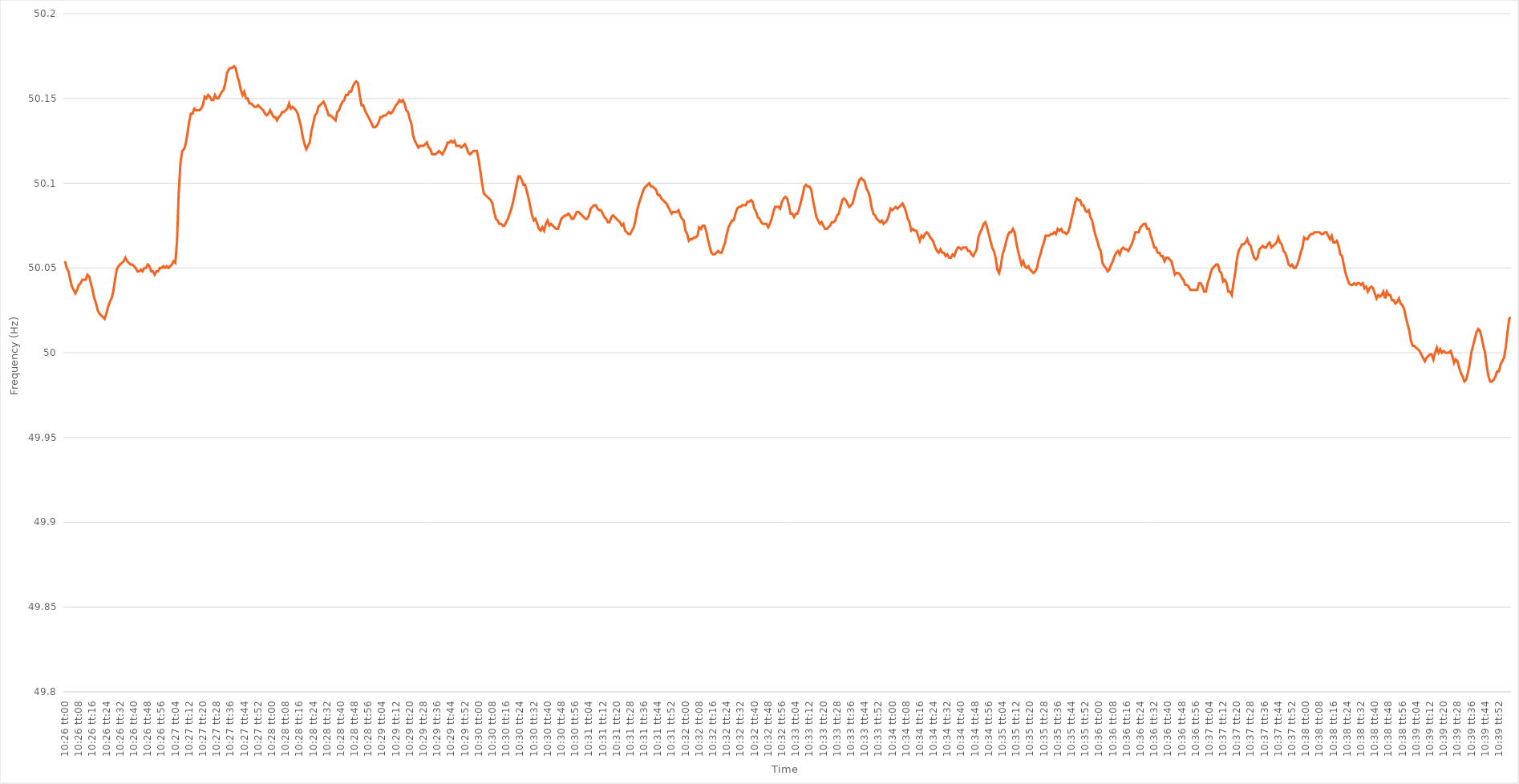
| Category | Series 0 |
|---|---|
| 0.43472222222222223 | 50.054 |
| 0.43473379629629627 | 50.05 |
| 0.43474537037037037 | 50.048 |
| 0.4347569444444444 | 50.043 |
| 0.43476851851851855 | 50.039 |
| 0.4347800925925926 | 50.037 |
| 0.4347916666666667 | 50.035 |
| 0.4348032407407407 | 50.037 |
| 0.4348148148148148 | 50.04 |
| 0.43482638888888886 | 50.041 |
| 0.434837962962963 | 50.043 |
| 0.43484953703703705 | 50.043 |
| 0.43486111111111114 | 50.043 |
| 0.4348726851851852 | 50.046 |
| 0.4348842592592593 | 50.045 |
| 0.4348958333333333 | 50.041 |
| 0.43490740740740735 | 50.037 |
| 0.4349189814814815 | 50.032 |
| 0.43493055555555554 | 50.029 |
| 0.43494212962962964 | 50.025 |
| 0.4349537037037037 | 50.023 |
| 0.43496527777777777 | 50.022 |
| 0.4349768518518518 | 50.021 |
| 0.43498842592592596 | 50.02 |
| 0.435 | 50.023 |
| 0.4350115740740741 | 50.027 |
| 0.43502314814814813 | 50.03 |
| 0.4350347222222222 | 50.032 |
| 0.43504629629629626 | 50.036 |
| 0.4350578703703704 | 50.043 |
| 0.43506944444444445 | 50.049 |
| 0.43508101851851855 | 50.051 |
| 0.4350925925925926 | 50.052 |
| 0.4351041666666667 | 50.053 |
| 0.4351157407407407 | 50.054 |
| 0.43512731481481487 | 50.056 |
| 0.4351388888888889 | 50.054 |
| 0.43515046296296295 | 50.053 |
| 0.43516203703703704 | 50.052 |
| 0.4351736111111111 | 50.052 |
| 0.4351851851851852 | 50.051 |
| 0.4351967592592592 | 50.05 |
| 0.43520833333333336 | 50.048 |
| 0.4352199074074074 | 50.048 |
| 0.4352314814814815 | 50.049 |
| 0.43524305555555554 | 50.048 |
| 0.43525462962962963 | 50.05 |
| 0.43526620370370367 | 50.05 |
| 0.4352777777777778 | 50.052 |
| 0.43528935185185186 | 50.051 |
| 0.43530092592592595 | 50.048 |
| 0.4353125 | 50.048 |
| 0.4353240740740741 | 50.046 |
| 0.4353356481481481 | 50.048 |
| 0.4353472222222223 | 50.048 |
| 0.4353587962962963 | 50.05 |
| 0.43537037037037035 | 50.05 |
| 0.43538194444444445 | 50.051 |
| 0.4353935185185185 | 50.05 |
| 0.4354050925925926 | 50.051 |
| 0.4354166666666666 | 50.05 |
| 0.43542824074074077 | 50.051 |
| 0.4354398148148148 | 50.052 |
| 0.4354513888888889 | 50.054 |
| 0.43546296296296294 | 50.053 |
| 0.43547453703703703 | 50.066 |
| 0.4354861111111111 | 50.095 |
| 0.4354976851851852 | 50.112 |
| 0.43550925925925926 | 50.119 |
| 0.43552083333333336 | 50.12 |
| 0.4355324074074074 | 50.123 |
| 0.4355439814814815 | 50.129 |
| 0.43555555555555553 | 50.136 |
| 0.4355671296296297 | 50.141 |
| 0.4355787037037037 | 50.141 |
| 0.4355902777777778 | 50.144 |
| 0.43560185185185185 | 50.143 |
| 0.43561342592592595 | 50.143 |
| 0.435625 | 50.143 |
| 0.435636574074074 | 50.144 |
| 0.4356481481481482 | 50.146 |
| 0.4356597222222222 | 50.151 |
| 0.4356712962962963 | 50.15 |
| 0.43568287037037035 | 50.152 |
| 0.43569444444444444 | 50.151 |
| 0.4357060185185185 | 50.149 |
| 0.43571759259259263 | 50.149 |
| 0.43572916666666667 | 50.152 |
| 0.43574074074074076 | 50.15 |
| 0.4357523148148148 | 50.15 |
| 0.4357638888888889 | 50.152 |
| 0.43577546296296293 | 50.154 |
| 0.4357870370370371 | 50.155 |
| 0.4357986111111111 | 50.159 |
| 0.4358101851851852 | 50.165 |
| 0.43582175925925926 | 50.167 |
| 0.43583333333333335 | 50.168 |
| 0.4358449074074074 | 50.168 |
| 0.43585648148148143 | 50.169 |
| 0.4358680555555556 | 50.168 |
| 0.4358796296296296 | 50.163 |
| 0.4358912037037037 | 50.16 |
| 0.43590277777777775 | 50.155 |
| 0.43591435185185184 | 50.152 |
| 0.4359259259259259 | 50.154 |
| 0.43593750000000003 | 50.15 |
| 0.43594907407407407 | 50.15 |
| 0.43596064814814817 | 50.147 |
| 0.4359722222222222 | 50.147 |
| 0.4359837962962963 | 50.146 |
| 0.43599537037037034 | 50.145 |
| 0.4360069444444445 | 50.145 |
| 0.4360185185185185 | 50.146 |
| 0.4360300925925926 | 50.145 |
| 0.43604166666666666 | 50.144 |
| 0.43605324074074076 | 50.143 |
| 0.4360648148148148 | 50.141 |
| 0.43607638888888883 | 50.14 |
| 0.436087962962963 | 50.141 |
| 0.436099537037037 | 50.143 |
| 0.4361111111111111 | 50.141 |
| 0.43612268518518515 | 50.139 |
| 0.43613425925925925 | 50.139 |
| 0.4361458333333333 | 50.137 |
| 0.43615740740740744 | 50.139 |
| 0.4361689814814815 | 50.14 |
| 0.43618055555555557 | 50.142 |
| 0.4361921296296296 | 50.142 |
| 0.4362037037037037 | 50.143 |
| 0.43621527777777774 | 50.144 |
| 0.4362268518518519 | 50.147 |
| 0.43623842592592593 | 50.144 |
| 0.43625 | 50.145 |
| 0.43626157407407407 | 50.144 |
| 0.43627314814814816 | 50.143 |
| 0.4362847222222222 | 50.141 |
| 0.43629629629629635 | 50.137 |
| 0.4363078703703704 | 50.133 |
| 0.4363194444444445 | 50.127 |
| 0.4363310185185185 | 50.123 |
| 0.43634259259259256 | 50.12 |
| 0.43635416666666665 | 50.122 |
| 0.4363657407407407 | 50.124 |
| 0.43637731481481484 | 50.131 |
| 0.4363888888888889 | 50.135 |
| 0.436400462962963 | 50.14 |
| 0.436412037037037 | 50.141 |
| 0.4364236111111111 | 50.145 |
| 0.43643518518518515 | 50.146 |
| 0.4364467592592593 | 50.147 |
| 0.43645833333333334 | 50.148 |
| 0.43646990740740743 | 50.146 |
| 0.43648148148148147 | 50.143 |
| 0.43649305555555556 | 50.14 |
| 0.4365046296296296 | 50.14 |
| 0.43651620370370375 | 50.139 |
| 0.4365277777777778 | 50.138 |
| 0.4365393518518519 | 50.137 |
| 0.4365509259259259 | 50.142 |
| 0.43656249999999996 | 50.143 |
| 0.43657407407407406 | 50.146 |
| 0.4365856481481481 | 50.148 |
| 0.43659722222222225 | 50.149 |
| 0.4366087962962963 | 50.152 |
| 0.4366203703703704 | 50.152 |
| 0.4366319444444444 | 50.154 |
| 0.4366435185185185 | 50.154 |
| 0.43665509259259255 | 50.157 |
| 0.4366666666666667 | 50.159 |
| 0.43667824074074074 | 50.16 |
| 0.43668981481481484 | 50.159 |
| 0.4367013888888889 | 50.152 |
| 0.43671296296296297 | 50.146 |
| 0.436724537037037 | 50.146 |
| 0.43673611111111116 | 50.143 |
| 0.4367476851851852 | 50.141 |
| 0.4367592592592593 | 50.139 |
| 0.43677083333333333 | 50.137 |
| 0.43678240740740737 | 50.135 |
| 0.43679398148148146 | 50.133 |
| 0.4368055555555555 | 50.133 |
| 0.43681712962962965 | 50.134 |
| 0.4368287037037037 | 50.136 |
| 0.4368402777777778 | 50.139 |
| 0.4368518518518518 | 50.139 |
| 0.4368634259259259 | 50.14 |
| 0.43687499999999996 | 50.14 |
| 0.4368865740740741 | 50.141 |
| 0.43689814814814815 | 50.142 |
| 0.43690972222222224 | 50.141 |
| 0.4369212962962963 | 50.142 |
| 0.4369328703703704 | 50.144 |
| 0.4369444444444444 | 50.146 |
| 0.43695601851851856 | 50.147 |
| 0.4369675925925926 | 50.149 |
| 0.4369791666666667 | 50.148 |
| 0.43699074074074074 | 50.149 |
| 0.43700231481481483 | 50.147 |
| 0.43701388888888887 | 50.143 |
| 0.437025462962963 | 50.142 |
| 0.43703703703703706 | 50.138 |
| 0.4370486111111111 | 50.135 |
| 0.4370601851851852 | 50.128 |
| 0.43707175925925923 | 50.125 |
| 0.4370833333333333 | 50.123 |
| 0.43709490740740736 | 50.121 |
| 0.4371064814814815 | 50.122 |
| 0.43711805555555555 | 50.122 |
| 0.43712962962962965 | 50.122 |
| 0.4371412037037037 | 50.123 |
| 0.4371527777777778 | 50.124 |
| 0.4371643518518518 | 50.121 |
| 0.43717592592592597 | 50.12 |
| 0.4371875 | 50.117 |
| 0.4371990740740741 | 50.117 |
| 0.43721064814814814 | 50.117 |
| 0.43722222222222223 | 50.118 |
| 0.4372337962962963 | 50.119 |
| 0.4372453703703704 | 50.118 |
| 0.43725694444444446 | 50.117 |
| 0.4372685185185185 | 50.119 |
| 0.4372800925925926 | 50.121 |
| 0.43729166666666663 | 50.124 |
| 0.43730324074074073 | 50.124 |
| 0.43731481481481477 | 50.125 |
| 0.4373263888888889 | 50.124 |
| 0.43733796296296296 | 50.125 |
| 0.43734953703703705 | 50.122 |
| 0.4373611111111111 | 50.122 |
| 0.4373726851851852 | 50.122 |
| 0.4373842592592592 | 50.121 |
| 0.4373958333333334 | 50.122 |
| 0.4374074074074074 | 50.123 |
| 0.4374189814814815 | 50.121 |
| 0.43743055555555554 | 50.118 |
| 0.43744212962962964 | 50.117 |
| 0.4374537037037037 | 50.118 |
| 0.43746527777777783 | 50.119 |
| 0.43747685185185187 | 50.119 |
| 0.43748842592592596 | 50.119 |
| 0.4375 | 50.114 |
| 0.43751157407407404 | 50.107 |
| 0.43752314814814813 | 50.1 |
| 0.43753472222222217 | 50.094 |
| 0.4375462962962963 | 50.093 |
| 0.43755787037037036 | 50.092 |
| 0.43756944444444446 | 50.091 |
| 0.4375810185185185 | 50.09 |
| 0.4375925925925926 | 50.088 |
| 0.4376041666666666 | 50.083 |
| 0.4376157407407408 | 50.079 |
| 0.4376273148148148 | 50.078 |
| 0.4376388888888889 | 50.076 |
| 0.43765046296296295 | 50.076 |
| 0.43766203703703704 | 50.075 |
| 0.4376736111111111 | 50.075 |
| 0.43768518518518523 | 50.077 |
| 0.43769675925925927 | 50.079 |
| 0.43770833333333337 | 50.082 |
| 0.4377199074074074 | 50.085 |
| 0.4377314814814815 | 50.089 |
| 0.43774305555555554 | 50.094 |
| 0.4377546296296296 | 50.099 |
| 0.4377662037037037 | 50.104 |
| 0.43777777777777777 | 50.104 |
| 0.43778935185185186 | 50.102 |
| 0.4378009259259259 | 50.099 |
| 0.4378125 | 50.099 |
| 0.43782407407407403 | 50.095 |
| 0.4378356481481482 | 50.091 |
| 0.4378472222222222 | 50.086 |
| 0.4378587962962963 | 50.081 |
| 0.43787037037037035 | 50.078 |
| 0.43788194444444445 | 50.079 |
| 0.4378935185185185 | 50.076 |
| 0.43790509259259264 | 50.073 |
| 0.4379166666666667 | 50.072 |
| 0.43792824074074077 | 50.074 |
| 0.4379398148148148 | 50.072 |
| 0.4379513888888889 | 50.076 |
| 0.43796296296296294 | 50.078 |
| 0.437974537037037 | 50.075 |
| 0.43798611111111113 | 50.076 |
| 0.43799768518518517 | 50.075 |
| 0.43800925925925926 | 50.074 |
| 0.4380208333333333 | 50.073 |
| 0.4380324074074074 | 50.073 |
| 0.43804398148148144 | 50.076 |
| 0.4380555555555556 | 50.079 |
| 0.4380671296296296 | 50.08 |
| 0.4380787037037037 | 50.081 |
| 0.43809027777777776 | 50.081 |
| 0.43810185185185185 | 50.082 |
| 0.4381134259259259 | 50.081 |
| 0.43812500000000004 | 50.079 |
| 0.4381365740740741 | 50.079 |
| 0.4381481481481482 | 50.081 |
| 0.4381597222222222 | 50.083 |
| 0.4381712962962963 | 50.083 |
| 0.43818287037037035 | 50.082 |
| 0.4381944444444445 | 50.081 |
| 0.43820601851851854 | 50.08 |
| 0.43821759259259263 | 50.079 |
| 0.43822916666666667 | 50.079 |
| 0.4382407407407407 | 50.081 |
| 0.4382523148148148 | 50.085 |
| 0.43826388888888884 | 50.086 |
| 0.438275462962963 | 50.087 |
| 0.43828703703703703 | 50.087 |
| 0.4382986111111111 | 50.085 |
| 0.43831018518518516 | 50.084 |
| 0.43832175925925926 | 50.084 |
| 0.4383333333333333 | 50.082 |
| 0.43834490740740745 | 50.08 |
| 0.4383564814814815 | 50.079 |
| 0.4383680555555556 | 50.077 |
| 0.4383796296296296 | 50.077 |
| 0.4383912037037037 | 50.08 |
| 0.43840277777777775 | 50.081 |
| 0.4384143518518519 | 50.08 |
| 0.43842592592592594 | 50.079 |
| 0.43843750000000004 | 50.078 |
| 0.4384490740740741 | 50.077 |
| 0.4384606481481481 | 50.075 |
| 0.4384722222222222 | 50.076 |
| 0.43848379629629625 | 50.072 |
| 0.4384953703703704 | 50.071 |
| 0.43850694444444444 | 50.07 |
| 0.43851851851851853 | 50.07 |
| 0.43853009259259257 | 50.072 |
| 0.43854166666666666 | 50.074 |
| 0.4385532407407407 | 50.078 |
| 0.43856481481481485 | 50.084 |
| 0.4385763888888889 | 50.088 |
| 0.438587962962963 | 50.091 |
| 0.438599537037037 | 50.094 |
| 0.4386111111111111 | 50.097 |
| 0.43862268518518516 | 50.098 |
| 0.4386342592592593 | 50.099 |
| 0.43864583333333335 | 50.1 |
| 0.43865740740740744 | 50.098 |
| 0.4386689814814815 | 50.098 |
| 0.4386805555555555 | 50.097 |
| 0.4386921296296296 | 50.096 |
| 0.43870370370370365 | 50.093 |
| 0.4387152777777778 | 50.093 |
| 0.43872685185185184 | 50.091 |
| 0.43873842592592593 | 50.09 |
| 0.43875 | 50.089 |
| 0.43876157407407407 | 50.088 |
| 0.4387731481481481 | 50.086 |
| 0.43878472222222226 | 50.084 |
| 0.4387962962962963 | 50.082 |
| 0.4388078703703704 | 50.083 |
| 0.43881944444444443 | 50.083 |
| 0.4388310185185185 | 50.083 |
| 0.43884259259259256 | 50.084 |
| 0.4388541666666667 | 50.081 |
| 0.43886574074074075 | 50.079 |
| 0.43887731481481485 | 50.078 |
| 0.4388888888888889 | 50.072 |
| 0.438900462962963 | 50.07 |
| 0.438912037037037 | 50.066 |
| 0.43892361111111106 | 50.067 |
| 0.4389351851851852 | 50.067 |
| 0.43894675925925924 | 50.068 |
| 0.43895833333333334 | 50.068 |
| 0.4389699074074074 | 50.069 |
| 0.4389814814814815 | 50.074 |
| 0.4389930555555555 | 50.073 |
| 0.43900462962962966 | 50.075 |
| 0.4390162037037037 | 50.075 |
| 0.4390277777777778 | 50.072 |
| 0.43903935185185183 | 50.067 |
| 0.43905092592592593 | 50.063 |
| 0.43906249999999997 | 50.059 |
| 0.4390740740740741 | 50.058 |
| 0.43908564814814816 | 50.058 |
| 0.43909722222222225 | 50.059 |
| 0.4391087962962963 | 50.06 |
| 0.4391203703703704 | 50.059 |
| 0.4391319444444444 | 50.059 |
| 0.43914351851851857 | 50.062 |
| 0.4391550925925926 | 50.065 |
| 0.43916666666666665 | 50.07 |
| 0.43917824074074074 | 50.074 |
| 0.4391898148148148 | 50.076 |
| 0.4392013888888889 | 50.078 |
| 0.4392129629629629 | 50.078 |
| 0.43922453703703707 | 50.082 |
| 0.4392361111111111 | 50.085 |
| 0.4392476851851852 | 50.086 |
| 0.43925925925925924 | 50.086 |
| 0.43927083333333333 | 50.087 |
| 0.43928240740740737 | 50.087 |
| 0.4392939814814815 | 50.087 |
| 0.43930555555555556 | 50.089 |
| 0.43931712962962965 | 50.089 |
| 0.4393287037037037 | 50.09 |
| 0.4393402777777778 | 50.089 |
| 0.4393518518518518 | 50.085 |
| 0.439363425925926 | 50.083 |
| 0.439375 | 50.08 |
| 0.4393865740740741 | 50.079 |
| 0.43939814814814815 | 50.077 |
| 0.4394097222222222 | 50.076 |
| 0.4394212962962963 | 50.076 |
| 0.4394328703703703 | 50.076 |
| 0.43944444444444447 | 50.074 |
| 0.4394560185185185 | 50.076 |
| 0.4394675925925926 | 50.079 |
| 0.43947916666666664 | 50.083 |
| 0.43949074074074074 | 50.086 |
| 0.4395023148148148 | 50.086 |
| 0.4395138888888889 | 50.086 |
| 0.43952546296296297 | 50.085 |
| 0.43953703703703706 | 50.089 |
| 0.4395486111111111 | 50.091 |
| 0.4395601851851852 | 50.092 |
| 0.43957175925925923 | 50.091 |
| 0.4395833333333334 | 50.087 |
| 0.4395949074074074 | 50.082 |
| 0.4396064814814815 | 50.082 |
| 0.43961805555555555 | 50.08 |
| 0.43962962962962965 | 50.082 |
| 0.4396412037037037 | 50.082 |
| 0.4396527777777777 | 50.085 |
| 0.4396643518518519 | 50.089 |
| 0.4396759259259259 | 50.093 |
| 0.4396875 | 50.098 |
| 0.43969907407407405 | 50.099 |
| 0.43971064814814814 | 50.098 |
| 0.4397222222222222 | 50.098 |
| 0.43973379629629633 | 50.096 |
| 0.43974537037037037 | 50.09 |
| 0.43975694444444446 | 50.085 |
| 0.4397685185185185 | 50.08 |
| 0.4397800925925926 | 50.078 |
| 0.43979166666666664 | 50.076 |
| 0.4398032407407408 | 50.077 |
| 0.4398148148148148 | 50.075 |
| 0.4398263888888889 | 50.073 |
| 0.43983796296296296 | 50.073 |
| 0.43984953703703705 | 50.074 |
| 0.4398611111111111 | 50.075 |
| 0.43987268518518513 | 50.077 |
| 0.4398842592592593 | 50.077 |
| 0.4398958333333333 | 50.078 |
| 0.4399074074074074 | 50.081 |
| 0.43991898148148145 | 50.082 |
| 0.43993055555555555 | 50.086 |
| 0.4399421296296296 | 50.09 |
| 0.43995370370370374 | 50.091 |
| 0.4399652777777778 | 50.09 |
| 0.43997685185185187 | 50.088 |
| 0.4399884259259259 | 50.086 |
| 0.44 | 50.087 |
| 0.44001157407407404 | 50.088 |
| 0.4400231481481482 | 50.092 |
| 0.44003472222222223 | 50.096 |
| 0.4400462962962963 | 50.099 |
| 0.44005787037037036 | 50.102 |
| 0.44006944444444446 | 50.103 |
| 0.4400810185185185 | 50.102 |
| 0.44009259259259265 | 50.101 |
| 0.4401041666666667 | 50.097 |
| 0.4401157407407407 | 50.095 |
| 0.4401273148148148 | 50.092 |
| 0.44013888888888886 | 50.086 |
| 0.44015046296296295 | 50.082 |
| 0.440162037037037 | 50.081 |
| 0.44017361111111114 | 50.079 |
| 0.4401851851851852 | 50.078 |
| 0.4401967592592593 | 50.077 |
| 0.4402083333333333 | 50.078 |
| 0.4402199074074074 | 50.076 |
| 0.44023148148148145 | 50.077 |
| 0.4402430555555556 | 50.078 |
| 0.44025462962962963 | 50.081 |
| 0.44026620370370373 | 50.085 |
| 0.44027777777777777 | 50.084 |
| 0.44028935185185186 | 50.085 |
| 0.4403009259259259 | 50.086 |
| 0.44031250000000005 | 50.085 |
| 0.4403240740740741 | 50.086 |
| 0.4403356481481482 | 50.087 |
| 0.4403472222222222 | 50.088 |
| 0.44035879629629626 | 50.086 |
| 0.44037037037037036 | 50.083 |
| 0.4403819444444444 | 50.079 |
| 0.44039351851851855 | 50.077 |
| 0.4404050925925926 | 50.072 |
| 0.4404166666666667 | 50.073 |
| 0.4404282407407407 | 50.072 |
| 0.4404398148148148 | 50.072 |
| 0.44045138888888885 | 50.069 |
| 0.440462962962963 | 50.066 |
| 0.44047453703703704 | 50.069 |
| 0.44048611111111113 | 50.068 |
| 0.4404976851851852 | 50.07 |
| 0.44050925925925927 | 50.071 |
| 0.4405208333333333 | 50.07 |
| 0.44053240740740746 | 50.068 |
| 0.4405439814814815 | 50.067 |
| 0.4405555555555556 | 50.065 |
| 0.44056712962962963 | 50.062 |
| 0.44057870370370367 | 50.06 |
| 0.44059027777777776 | 50.059 |
| 0.4406018518518518 | 50.061 |
| 0.44061342592592595 | 50.059 |
| 0.440625 | 50.059 |
| 0.4406365740740741 | 50.057 |
| 0.4406481481481481 | 50.058 |
| 0.4406597222222222 | 50.056 |
| 0.44067129629629626 | 50.056 |
| 0.4406828703703704 | 50.058 |
| 0.44069444444444444 | 50.057 |
| 0.44070601851851854 | 50.06 |
| 0.4407175925925926 | 50.062 |
| 0.44072916666666667 | 50.062 |
| 0.4407407407407407 | 50.061 |
| 0.44075231481481486 | 50.062 |
| 0.4407638888888889 | 50.062 |
| 0.440775462962963 | 50.062 |
| 0.44078703703703703 | 50.06 |
| 0.4407986111111111 | 50.06 |
| 0.44081018518518517 | 50.058 |
| 0.4408217592592592 | 50.057 |
| 0.44083333333333335 | 50.059 |
| 0.4408449074074074 | 50.061 |
| 0.4408564814814815 | 50.068 |
| 0.4408680555555555 | 50.071 |
| 0.4408796296296296 | 50.073 |
| 0.44089120370370366 | 50.076 |
| 0.4409027777777778 | 50.077 |
| 0.44091435185185185 | 50.074 |
| 0.44092592592592594 | 50.07 |
| 0.4409375 | 50.066 |
| 0.4409490740740741 | 50.062 |
| 0.4409606481481481 | 50.06 |
| 0.44097222222222227 | 50.056 |
| 0.4409837962962963 | 50.049 |
| 0.4409953703703704 | 50.047 |
| 0.44100694444444444 | 50.051 |
| 0.44101851851851853 | 50.058 |
| 0.44103009259259257 | 50.061 |
| 0.4410416666666667 | 50.065 |
| 0.44105324074074076 | 50.069 |
| 0.4410648148148148 | 50.071 |
| 0.4410763888888889 | 50.071 |
| 0.44108796296296293 | 50.073 |
| 0.441099537037037 | 50.071 |
| 0.44111111111111106 | 50.065 |
| 0.4411226851851852 | 50.06 |
| 0.44113425925925925 | 50.056 |
| 0.44114583333333335 | 50.052 |
| 0.4411574074074074 | 50.054 |
| 0.4411689814814815 | 50.051 |
| 0.4411805555555555 | 50.05 |
| 0.44119212962962967 | 50.051 |
| 0.4412037037037037 | 50.049 |
| 0.4412152777777778 | 50.048 |
| 0.44122685185185184 | 50.047 |
| 0.44123842592592594 | 50.048 |
| 0.44125 | 50.05 |
| 0.4412615740740741 | 50.055 |
| 0.44127314814814816 | 50.058 |
| 0.44128472222222226 | 50.062 |
| 0.4412962962962963 | 50.065 |
| 0.44130787037037034 | 50.069 |
| 0.44131944444444443 | 50.069 |
| 0.44133101851851847 | 50.069 |
| 0.4413425925925926 | 50.07 |
| 0.44135416666666666 | 50.07 |
| 0.44136574074074075 | 50.071 |
| 0.4413773148148148 | 50.07 |
| 0.4413888888888889 | 50.073 |
| 0.4414004629629629 | 50.072 |
| 0.4414120370370371 | 50.073 |
| 0.4414236111111111 | 50.071 |
| 0.4414351851851852 | 50.071 |
| 0.44144675925925925 | 50.07 |
| 0.44145833333333334 | 50.071 |
| 0.4414699074074074 | 50.074 |
| 0.44148148148148153 | 50.079 |
| 0.44149305555555557 | 50.083 |
| 0.44150462962962966 | 50.088 |
| 0.4415162037037037 | 50.091 |
| 0.44152777777777774 | 50.09 |
| 0.44153935185185184 | 50.09 |
| 0.4415509259259259 | 50.087 |
| 0.4415625 | 50.087 |
| 0.44157407407407406 | 50.084 |
| 0.44158564814814816 | 50.083 |
| 0.4415972222222222 | 50.084 |
| 0.4416087962962963 | 50.08 |
| 0.44162037037037033 | 50.078 |
| 0.4416319444444445 | 50.073 |
| 0.4416435185185185 | 50.069 |
| 0.4416550925925926 | 50.066 |
| 0.44166666666666665 | 50.062 |
| 0.44167824074074075 | 50.06 |
| 0.4416898148148148 | 50.053 |
| 0.44170138888888894 | 50.051 |
| 0.441712962962963 | 50.05 |
| 0.44172453703703707 | 50.048 |
| 0.4417361111111111 | 50.049 |
| 0.4417476851851852 | 50.052 |
| 0.44175925925925924 | 50.054 |
| 0.4417708333333333 | 50.057 |
| 0.44178240740740743 | 50.059 |
| 0.44179398148148147 | 50.06 |
| 0.44180555555555556 | 50.058 |
| 0.4418171296296296 | 50.061 |
| 0.4418287037037037 | 50.062 |
| 0.44184027777777773 | 50.061 |
| 0.4418518518518519 | 50.061 |
| 0.4418634259259259 | 50.06 |
| 0.441875 | 50.062 |
| 0.44188657407407406 | 50.064 |
| 0.44189814814814815 | 50.067 |
| 0.4419097222222222 | 50.071 |
| 0.44192129629629634 | 50.071 |
| 0.4419328703703704 | 50.071 |
| 0.4419444444444445 | 50.074 |
| 0.4419560185185185 | 50.075 |
| 0.4419675925925926 | 50.076 |
| 0.44197916666666665 | 50.076 |
| 0.4419907407407408 | 50.073 |
| 0.44200231481481483 | 50.073 |
| 0.4420138888888889 | 50.069 |
| 0.44202546296296297 | 50.066 |
| 0.442037037037037 | 50.062 |
| 0.4420486111111111 | 50.062 |
| 0.44206018518518514 | 50.059 |
| 0.4420717592592593 | 50.059 |
| 0.44208333333333333 | 50.057 |
| 0.4420949074074074 | 50.057 |
| 0.44210648148148146 | 50.054 |
| 0.44211805555555556 | 50.056 |
| 0.4421296296296296 | 50.056 |
| 0.44214120370370374 | 50.055 |
| 0.4421527777777778 | 50.054 |
| 0.4421643518518519 | 50.05 |
| 0.4421759259259259 | 50.046 |
| 0.4421875 | 50.047 |
| 0.44219907407407405 | 50.047 |
| 0.4422106481481482 | 50.046 |
| 0.44222222222222224 | 50.044 |
| 0.44223379629629633 | 50.043 |
| 0.44224537037037037 | 50.04 |
| 0.4422569444444444 | 50.04 |
| 0.4422685185185185 | 50.039 |
| 0.44228009259259254 | 50.037 |
| 0.4422916666666667 | 50.037 |
| 0.44230324074074073 | 50.037 |
| 0.4423148148148148 | 50.037 |
| 0.44232638888888887 | 50.037 |
| 0.44233796296296296 | 50.041 |
| 0.442349537037037 | 50.041 |
| 0.44236111111111115 | 50.039 |
| 0.4423726851851852 | 50.036 |
| 0.4423842592592593 | 50.036 |
| 0.4423958333333333 | 50.041 |
| 0.4424074074074074 | 50.044 |
| 0.44241898148148145 | 50.048 |
| 0.4424305555555556 | 50.05 |
| 0.44244212962962964 | 50.051 |
| 0.44245370370370374 | 50.052 |
| 0.4424652777777778 | 50.052 |
| 0.4424768518518518 | 50.048 |
| 0.4424884259259259 | 50.047 |
| 0.44249999999999995 | 50.042 |
| 0.4425115740740741 | 50.043 |
| 0.44252314814814814 | 50.041 |
| 0.44253472222222223 | 50.036 |
| 0.44254629629629627 | 50.036 |
| 0.44255787037037037 | 50.034 |
| 0.4425694444444444 | 50.041 |
| 0.44258101851851855 | 50.047 |
| 0.4425925925925926 | 50.055 |
| 0.4426041666666667 | 50.06 |
| 0.4426157407407407 | 50.062 |
| 0.4426273148148148 | 50.064 |
| 0.44263888888888886 | 50.064 |
| 0.442650462962963 | 50.065 |
| 0.44266203703703705 | 50.067 |
| 0.44267361111111114 | 50.064 |
| 0.4426851851851852 | 50.063 |
| 0.4426967592592593 | 50.059 |
| 0.4427083333333333 | 50.056 |
| 0.44271990740740735 | 50.055 |
| 0.4427314814814815 | 50.056 |
| 0.44274305555555554 | 50.061 |
| 0.44275462962962964 | 50.062 |
| 0.4427662037037037 | 50.063 |
| 0.44277777777777777 | 50.062 |
| 0.4427893518518518 | 50.062 |
| 0.44280092592592596 | 50.064 |
| 0.4428125 | 50.065 |
| 0.4428240740740741 | 50.062 |
| 0.44283564814814813 | 50.063 |
| 0.4428472222222222 | 50.064 |
| 0.44285879629629626 | 50.065 |
| 0.4428703703703704 | 50.068 |
| 0.44288194444444445 | 50.065 |
| 0.44289351851851855 | 50.064 |
| 0.4429050925925926 | 50.06 |
| 0.4429166666666667 | 50.059 |
| 0.4429282407407407 | 50.056 |
| 0.44293981481481487 | 50.052 |
| 0.4429513888888889 | 50.051 |
| 0.44296296296296295 | 50.052 |
| 0.44297453703703704 | 50.05 |
| 0.4429861111111111 | 50.05 |
| 0.4429976851851852 | 50.052 |
| 0.4430092592592592 | 50.055 |
| 0.44302083333333336 | 50.059 |
| 0.4430324074074074 | 50.062 |
| 0.4430439814814815 | 50.068 |
| 0.44305555555555554 | 50.067 |
| 0.44306712962962963 | 50.067 |
| 0.44307870370370367 | 50.069 |
| 0.4430902777777778 | 50.07 |
| 0.44310185185185186 | 50.07 |
| 0.44311342592592595 | 50.071 |
| 0.443125 | 50.071 |
| 0.4431365740740741 | 50.071 |
| 0.4431481481481481 | 50.071 |
| 0.4431597222222223 | 50.07 |
| 0.4431712962962963 | 50.07 |
| 0.44318287037037035 | 50.071 |
| 0.44319444444444445 | 50.071 |
| 0.4432060185185185 | 50.069 |
| 0.4432175925925926 | 50.067 |
| 0.4432291666666666 | 50.069 |
| 0.44324074074074077 | 50.065 |
| 0.4432523148148148 | 50.065 |
| 0.4432638888888889 | 50.066 |
| 0.44327546296296294 | 50.063 |
| 0.44328703703703703 | 50.058 |
| 0.4432986111111111 | 50.057 |
| 0.4433101851851852 | 50.052 |
| 0.44332175925925926 | 50.047 |
| 0.44333333333333336 | 50.044 |
| 0.4433449074074074 | 50.041 |
| 0.4433564814814815 | 50.04 |
| 0.44336805555555553 | 50.04 |
| 0.4433796296296297 | 50.041 |
| 0.4433912037037037 | 50.04 |
| 0.4434027777777778 | 50.041 |
| 0.44341435185185185 | 50.041 |
| 0.4434259259259259 | 50.04 |
| 0.4434375 | 50.041 |
| 0.443449074074074 | 50.038 |
| 0.4434606481481482 | 50.039 |
| 0.4434722222222222 | 50.036 |
| 0.4434837962962963 | 50.038 |
| 0.44349537037037035 | 50.039 |
| 0.44350694444444444 | 50.038 |
| 0.4435185185185185 | 50.035 |
| 0.44353009259259263 | 50.032 |
| 0.44354166666666667 | 50.034 |
| 0.44355324074074076 | 50.033 |
| 0.4435648148148148 | 50.034 |
| 0.4435763888888889 | 50.036 |
| 0.44358796296296293 | 50.032 |
| 0.4435995370370371 | 50.036 |
| 0.4436111111111111 | 50.034 |
| 0.4436226851851852 | 50.034 |
| 0.44363425925925926 | 50.031 |
| 0.44364583333333335 | 50.031 |
| 0.4436574074074074 | 50.029 |
| 0.44366898148148143 | 50.03 |
| 0.4436805555555556 | 50.032 |
| 0.4436921296296296 | 50.029 |
| 0.4437037037037037 | 50.028 |
| 0.44371527777777775 | 50.026 |
| 0.44372685185185184 | 50.021 |
| 0.4437384259259259 | 50.017 |
| 0.44375000000000003 | 50.013 |
| 0.44376157407407407 | 50.007 |
| 0.44377314814814817 | 50.004 |
| 0.4437847222222222 | 50.004 |
| 0.4437962962962963 | 50.003 |
| 0.44380787037037034 | 50.002 |
| 0.4438194444444445 | 50.001 |
| 0.4438310185185185 | 49.999 |
| 0.4438425925925926 | 49.997 |
| 0.44385416666666666 | 49.995 |
| 0.44386574074074076 | 49.997 |
| 0.4438773148148148 | 49.998 |
| 0.44388888888888894 | 49.999 |
| 0.443900462962963 | 49.999 |
| 0.443912037037037 | 49.996 |
| 0.4439236111111111 | 50 |
| 0.44393518518518515 | 50.003 |
| 0.44394675925925925 | 50 |
| 0.4439583333333333 | 50.002 |
| 0.44396990740740744 | 50 |
| 0.4439814814814815 | 50.001 |
| 0.44399305555555557 | 50 |
| 0.4440046296296296 | 50 |
| 0.4440162037037037 | 50 |
| 0.44402777777777774 | 50.001 |
| 0.4440393518518519 | 49.998 |
| 0.44405092592592593 | 49.994 |
| 0.4440625 | 49.996 |
| 0.44407407407407407 | 49.995 |
| 0.44408564814814816 | 49.991 |
| 0.4440972222222222 | 49.988 |
| 0.44410879629629635 | 49.986 |
| 0.4441203703703704 | 49.983 |
| 0.4441319444444444 | 49.984 |
| 0.4441435185185185 | 49.988 |
| 0.44415509259259256 | 49.993 |
| 0.44416666666666665 | 50 |
| 0.4441782407407407 | 50.004 |
| 0.44418981481481484 | 50.008 |
| 0.4442013888888889 | 50.012 |
| 0.444212962962963 | 50.014 |
| 0.444224537037037 | 50.013 |
| 0.4442361111111111 | 50.009 |
| 0.44424768518518515 | 50.004 |
| 0.4442592592592593 | 50 |
| 0.44427083333333334 | 49.992 |
| 0.44428240740740743 | 49.986 |
| 0.44429398148148147 | 49.983 |
| 0.44430555555555556 | 49.983 |
| 0.4443171296296296 | 49.984 |
| 0.44432870370370375 | 49.986 |
| 0.4443402777777778 | 49.989 |
| 0.4443518518518519 | 49.989 |
| 0.4443634259259259 | 49.993 |
| 0.44437499999999996 | 49.995 |
| 0.44438657407407406 | 49.997 |
| 0.4443981481481481 | 50.003 |
| 0.44440972222222225 | 50.012 |
| 0.4444212962962963 | 50.02 |
| 0.4444328703703704 | 50.021 |